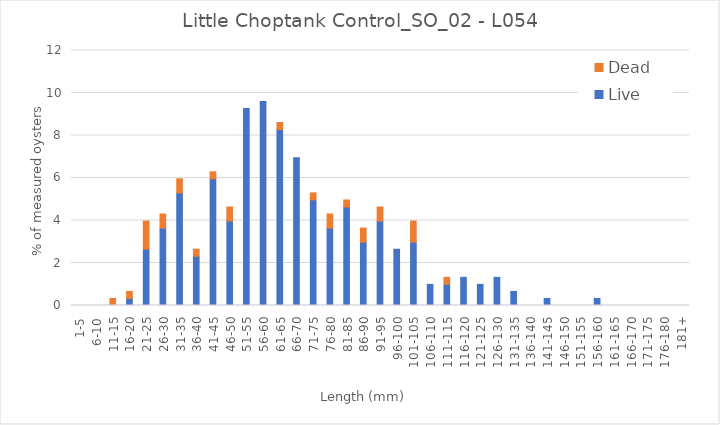
| Category | Live | Dead |
|---|---|---|
| 1-5 | 0 | 0 |
| 6-10 | 0 | 0 |
| 11-15 | 0 | 0.331 |
| 16-20 | 0.331 | 0.331 |
| 21-25 | 2.649 | 1.325 |
| 26-30 | 3.642 | 0.662 |
| 31-35 | 5.298 | 0.662 |
| 36-40 | 2.318 | 0.331 |
| 41-45 | 5.96 | 0.331 |
| 46-50 | 3.974 | 0.662 |
| 51-55 | 9.272 | 0 |
| 56-60 | 9.603 | 0 |
| 61-65 | 8.278 | 0.331 |
| 66-70 | 6.954 | 0 |
| 71-75 | 4.967 | 0.331 |
| 76-80 | 3.642 | 0.662 |
| 81-85 | 4.636 | 0.331 |
| 86-90 | 2.98 | 0.662 |
| 91-95 | 3.974 | 0.662 |
| 96-100 | 2.649 | 0 |
| 101-105 | 2.98 | 0.993 |
| 106-110 | 0.993 | 0 |
| 111-115 | 0.993 | 0.331 |
| 116-120 | 1.325 | 0 |
| 121-125 | 0.993 | 0 |
| 126-130 | 1.325 | 0 |
| 131-135 | 0.662 | 0 |
| 136-140 | 0 | 0 |
| 141-145 | 0.331 | 0 |
| 146-150 | 0 | 0 |
| 151-155 | 0 | 0 |
| 156-160 | 0.331 | 0 |
| 161-165 | 0 | 0 |
| 166-170 | 0 | 0 |
| 171-175 | 0 | 0 |
| 176-180 | 0 | 0 |
| 181+ | 0 | 0 |